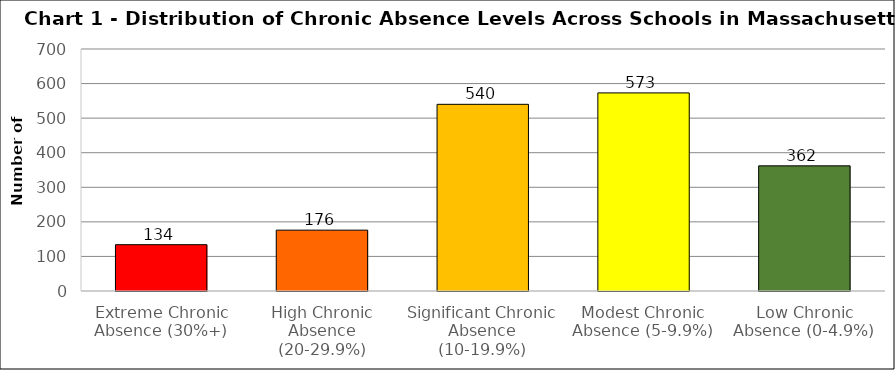
| Category | Series 0 |
|---|---|
| Extreme Chronic Absence (30%+) | 134 |
| High Chronic Absence (20-29.9%) | 176 |
| Significant Chronic Absence (10-19.9%) | 540 |
| Modest Chronic Absence (5-9.9%) | 573 |
| Low Chronic Absence (0-4.9%) | 362 |